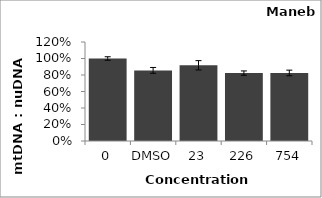
| Category | Series 1 |
|---|---|
| 0 | 1 |
| DMSO | 0.856 |
| 23 | 0.918 |
| 226 | 0.823 |
| 754 | 0.825 |